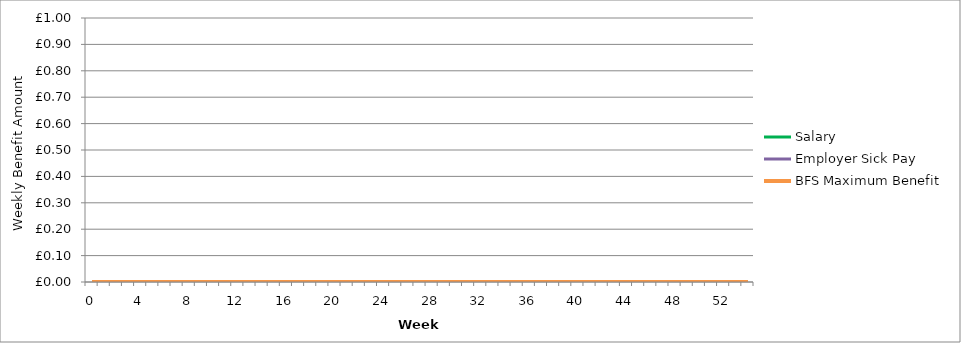
| Category | Salary | Employer Sick Pay | BFS Maximum Benefit |
|---|---|---|---|
| 0.0 | 0 | 0 | 0 |
| 1.0 | 0 | 0 | 0 |
| 2.0 | 0 | 0 | 0 |
| 3.0 | 0 | 0 | 0 |
| 4.0 | 0 | 0 | 0 |
| 5.0 | 0 | 0 | 0 |
| 6.0 | 0 | 0 | 0 |
| 7.0 | 0 | 0 | 0 |
| 8.0 | 0 | 0 | 0 |
| 9.0 | 0 | 0 | 0 |
| 10.0 | 0 | 0 | 0 |
| 11.0 | 0 | 0 | 0 |
| 12.0 | 0 | 0 | 0 |
| 13.0 | 0 | 0 | 0 |
| 14.0 | 0 | 0 | 0 |
| 15.0 | 0 | 0 | 0 |
| 16.0 | 0 | 0 | 0 |
| 17.0 | 0 | 0 | 0 |
| 18.0 | 0 | 0 | 0 |
| 19.0 | 0 | 0 | 0 |
| 20.0 | 0 | 0 | 0 |
| 21.0 | 0 | 0 | 0 |
| 22.0 | 0 | 0 | 0 |
| 23.0 | 0 | 0 | 0 |
| 24.0 | 0 | 0 | 0 |
| 25.0 | 0 | 0 | 0 |
| 26.0 | 0 | 0 | 0 |
| 27.0 | 0 | 0 | 0 |
| 28.0 | 0 | 0 | 0 |
| 29.0 | 0 | 0 | 0 |
| 30.0 | 0 | 0 | 0 |
| 31.0 | 0 | 0 | 0 |
| 32.0 | 0 | 0 | 0 |
| 33.0 | 0 | 0 | 0 |
| 34.0 | 0 | 0 | 0 |
| 35.0 | 0 | 0 | 0 |
| 36.0 | 0 | 0 | 0 |
| 37.0 | 0 | 0 | 0 |
| 38.0 | 0 | 0 | 0 |
| 39.0 | 0 | 0 | 0 |
| 40.0 | 0 | 0 | 0 |
| 41.0 | 0 | 0 | 0 |
| 42.0 | 0 | 0 | 0 |
| 43.0 | 0 | 0 | 0 |
| 44.0 | 0 | 0 | 0 |
| 45.0 | 0 | 0 | 0 |
| 46.0 | 0 | 0 | 0 |
| 47.0 | 0 | 0 | 0 |
| 48.0 | 0 | 0 | 0 |
| 49.0 | 0 | 0 | 0 |
| 50.0 | 0 | 0 | 0 |
| 51.0 | 0 | 0 | 0 |
| 52.0 | 0 | 0 | 0 |
| 53.0 | 0 | 0 | 0 |
| 54.0 | 0 | 0 | 0 |